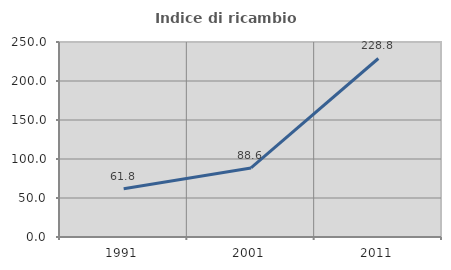
| Category | Indice di ricambio occupazionale  |
|---|---|
| 1991.0 | 61.777 |
| 2001.0 | 88.564 |
| 2011.0 | 228.85 |